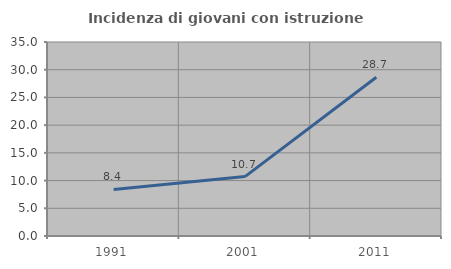
| Category | Incidenza di giovani con istruzione universitaria |
|---|---|
| 1991.0 | 8.403 |
| 2001.0 | 10.714 |
| 2011.0 | 28.652 |